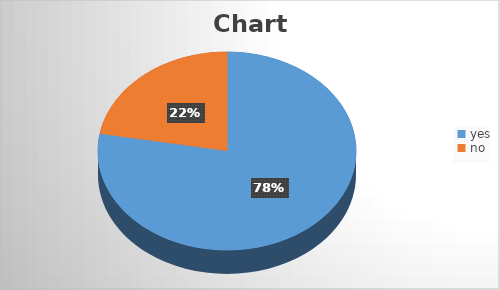
| Category | Series 0 |
|---|---|
| yes | 28 |
| no | 8 |